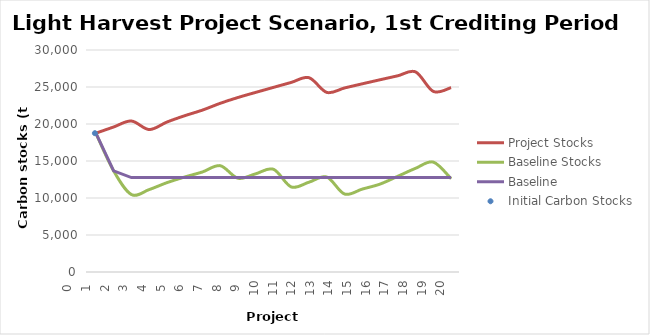
| Category | Project Stocks | Baseline Stocks | Baseline |
|---|---|---|---|
| 0.0 | 18758.947 | 18758.947 | 18758.947 |
| 1.0 | 19596.171 | 13662.69 | 13662.69 |
| 2.0 | 20404.45 | 10470.613 | 12760.404 |
| 3.0 | 19249.557 | 11138.194 | 12760.404 |
| 4.0 | 20264.485 | 12073.979 | 12760.404 |
| 5.0 | 21120.395 | 12837.19 | 12760.404 |
| 6.0 | 21877.378 | 13517.962 | 12760.404 |
| 7.0 | 22797.774 | 14364.712 | 12760.404 |
| 8.0 | 23582.237 | 12668.28 | 12760.404 |
| 9.0 | 24274 | 13271.741 | 12760.404 |
| 10.0 | 24950.008 | 13880.331 | 12760.404 |
| 11.0 | 25619.054 | 11494.334 | 12760.404 |
| 12.0 | 26255.109 | 12137.733 | 12760.404 |
| 13.0 | 24271.468 | 12832.061 | 12760.404 |
| 14.0 | 24872.045 | 10538.397 | 12760.404 |
| 15.0 | 25432.319 | 11206.71 | 12760.404 |
| 16.0 | 25979.768 | 11881.619 | 12760.404 |
| 17.0 | 26516.226 | 12937.218 | 12760.404 |
| 18.0 | 27039.859 | 14012.968 | 12760.404 |
| 19.0 | 24401.461 | 14849.826 | 12760.404 |
| 20.0 | 24914.102 | 12608.557 | 12760.404 |